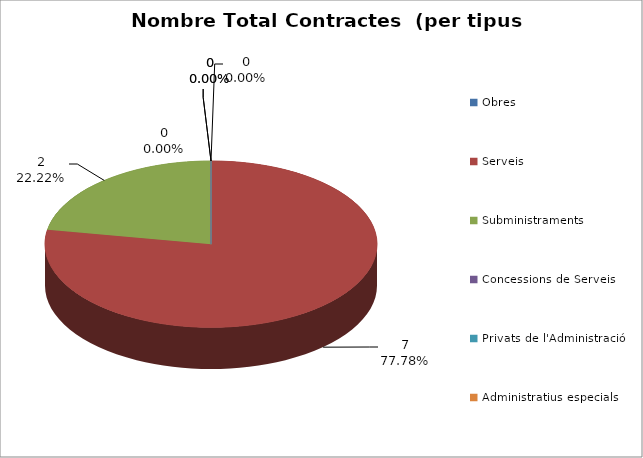
| Category | Nombre Total Contractes |
|---|---|
| Obres | 0 |
| Serveis | 7 |
| Subministraments | 2 |
| Concessions de Serveis | 0 |
| Privats de l'Administració | 0 |
| Administratius especials | 0 |